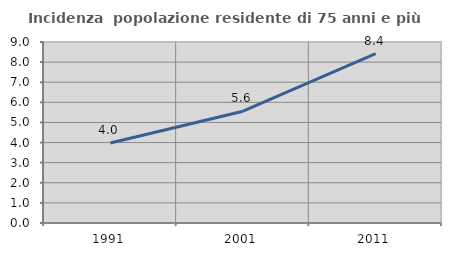
| Category | Incidenza  popolazione residente di 75 anni e più |
|---|---|
| 1991.0 | 3.975 |
| 2001.0 | 5.557 |
| 2011.0 | 8.428 |